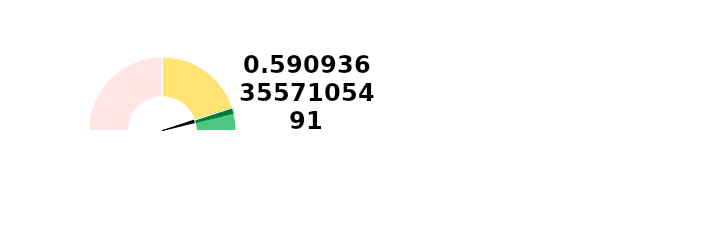
| Category | Ponteiro |
|---|---|
| 0 | 92.118 |
| 1 | 2.5 |
| 2 | 105.382 |